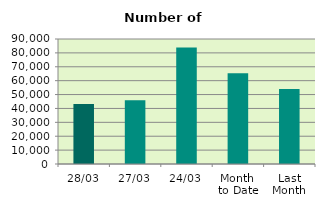
| Category | Series 0 |
|---|---|
| 28/03 | 43118 |
| 27/03 | 45822 |
| 24/03 | 83850 |
| Month 
to Date | 65275.2 |
| Last
Month | 54034.8 |